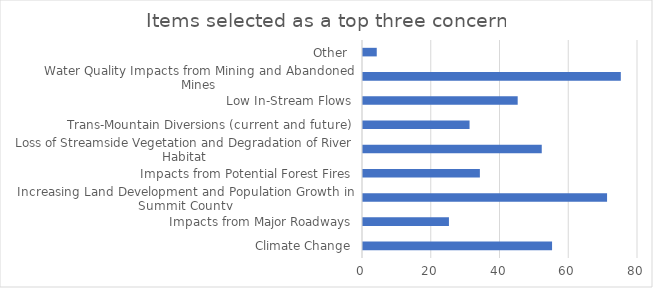
| Category | Series 0 |
|---|---|
| Climate Change | 55 |
| Impacts from Major Roadways | 25 |
| Increasing Land Development and Population Growth in Summit County | 71 |
| Impacts from Potential Forest Fires | 34 |
| Loss of Streamside Vegetation and Degradation of River Habitat | 52 |
| Trans-Mountain Diversions (current and future) | 31 |
| Low In-Stream Flows | 45 |
| Water Quality Impacts from Mining and Abandoned Mines | 75 |
| Other  | 4 |